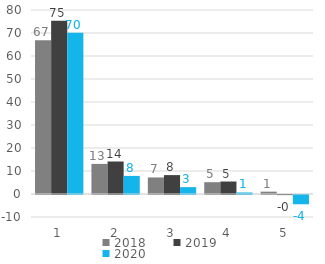
| Category | 2018 | 2019 | 2020 |
|---|---|---|---|
| 0 | 66.849 | 75.344 | 70.078 |
| 1 | 13.086 | 14.13 | 7.87 |
| 2 | 7.188 | 8.218 | 2.984 |
| 3 | 5.129 | 5.424 | 0.663 |
| 4 | 1.013 | -0.041 | -4.026 |